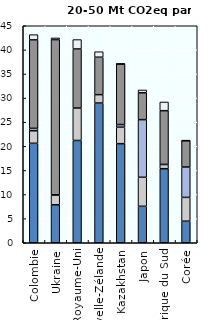
| Category | Fermentation entérique (CH4) | Gestion du fumier (CH4, N2O) | Riziculture (CH4) | Sol agricole (N2O) | Autres (CO2, CH4, N2O) |
|---|---|---|---|---|---|
| Colombie | 20.625 | 2.594 | 0.507 | 18.344 | 1.083 |
| Ukraine | 7.876 | 1.997 | 0.078 | 32.176 | 0.35 |
| Royaume-Uni | 21.214 | 6.723 | 0 | 12.25 | 1.947 |
| Nouvelle-Zélande | 28.975 | 1.739 | 0 | 7.763 | 1.141 |
| Kazakhstan | 20.546 | 3.418 | 0.546 | 12.576 | 0.003 |
| Japon | 7.563 | 6.018 | 11.946 | 5.581 | 0.574 |
| Afrique du Sud | 15.353 | 0.889 | 0.009 | 11.139 | 1.802 |
| Corée | 4.471 | 4.936 | 6.297 | 5.472 | 0.015 |